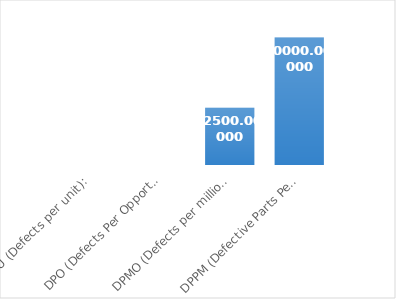
| Category | Series 0 |
|---|---|
| DPU (Defects per unit): | 0.09 |
| DPO (Defects Per Opportunity): | 0.022 |
| DPMO (Defects per million opportunities): | 22500 |
| DPPM (Defective Parts Per Million) : | 50000 |